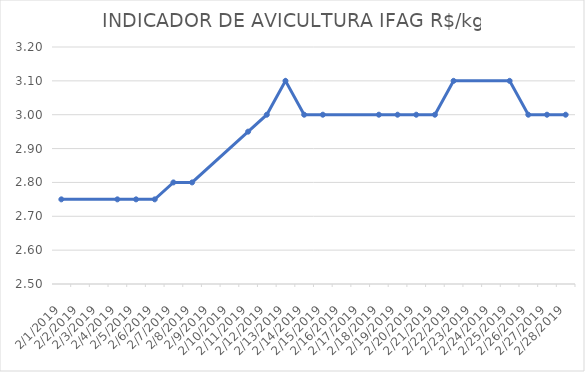
| Category | INDICADOR DE AVICULTURA IFAG |
|---|---|
| 2/1/19 | 2.75 |
| 2/4/19 | 2.75 |
| 2/5/19 | 2.75 |
| 2/6/19 | 2.75 |
| 2/7/19 | 2.8 |
| 2/8/19 | 2.8 |
| 2/11/19 | 2.95 |
| 2/12/19 | 3 |
| 2/13/19 | 3.1 |
| 2/14/19 | 3 |
| 2/15/19 | 3 |
| 2/18/19 | 3 |
| 2/19/19 | 3 |
| 2/20/19 | 3 |
| 2/21/19 | 3 |
| 2/22/19 | 3.1 |
| 2/25/19 | 3.1 |
| 2/26/19 | 3 |
| 2/27/19 | 3 |
| 2/28/19 | 3 |